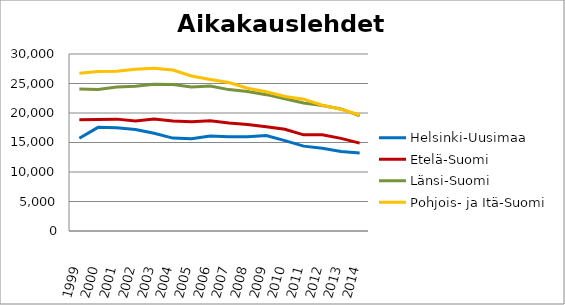
| Category | Helsinki-Uusimaa | Etelä-Suomi | Länsi-Suomi | Pohjois- ja Itä-Suomi |
|---|---|---|---|---|
| 1999.0 | 15717 | 18837 | 24074 | 26756 |
| 2000.0 | 17566 | 18919 | 23982 | 27038 |
| 2001.0 | 17480 | 18961 | 24403 | 27068 |
| 2002.0 | 17208 | 18630 | 24550 | 27408 |
| 2003.0 | 16572 | 18975 | 24878 | 27583 |
| 2004.0 | 15748 | 18651 | 24845 | 27292 |
| 2005.0 | 15654 | 18510 | 24428 | 26275 |
| 2006.0 | 16114 | 18690 | 24566 | 25691 |
| 2007.0 | 15981 | 18317 | 23964 | 25156 |
| 2008.0 | 15963 | 18033 | 23643 | 24193 |
| 2009.0 | 16170 | 17665 | 23109 | 23587 |
| 2010.0 | 15324 | 17249 | 22420 | 22801 |
| 2011.0 | 14382 | 16302 | 21685 | 22344 |
| 2012.0 | 14017 | 16311 | 21267 | 21311 |
| 2013.0 | 13465 | 15695 | 20687 | 20627 |
| 2014.0 | 13217 | 14900 | 19515 | 19670 |